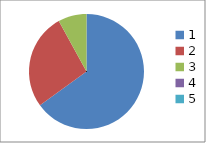
| Category | Series 0 |
|---|---|
| 0 | 0.65 |
| 1 | 0.27 |
| 2 | 0.08 |
| 3 | 0 |
| 4 | 0 |